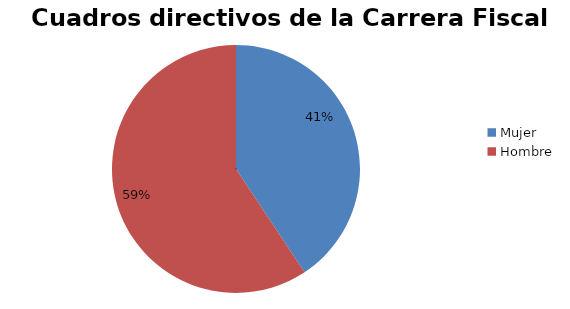
| Category | Series 0 |
|---|---|
| Mujer | 48 |
| Hombre | 70 |